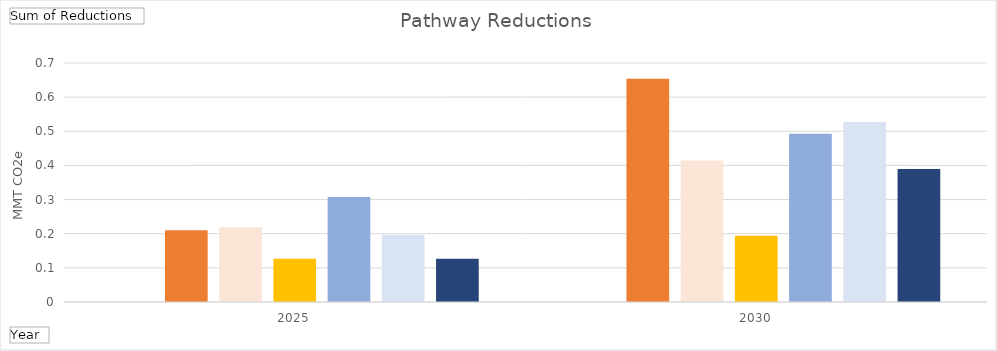
| Category | Electric - Electric | Thermal - Electrification | Thermal - Wood and Biofuels | Thermal - Weatherization & Efficiency | Transportation - Efficiency and Low Carbon Fuels | Transportation - Electrification | Transportation - Transportation Mode Changes |
|---|---|---|---|---|---|---|---|
| 2025 | 0 | 0.21 | 0.219 | 0.126 | 0.308 | 0.196 | 0.127 |
| 2030 | 0 | 0.654 | 0.414 | 0.194 | 0.492 | 0.527 | 0.39 |